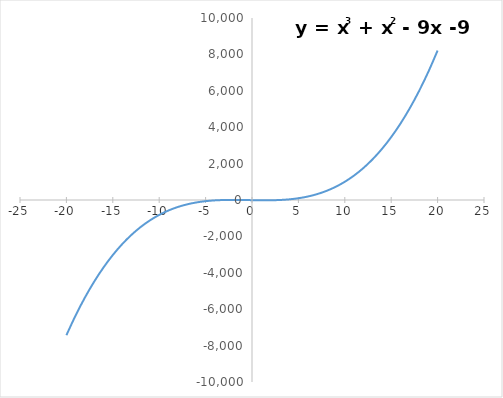
| Category | Series 0 |
|---|---|
| -20.0 | -7429 |
| -19.0 | -6336 |
| -18.0 | -5355 |
| -17.0 | -4480 |
| -16.0 | -3705 |
| -15.0 | -3024 |
| -14.0 | -2431 |
| -13.0 | -1920 |
| -12.0 | -1485 |
| -11.0 | -1120 |
| -10.0 | -819 |
| -9.0 | -576 |
| -8.0 | -385 |
| -7.0 | -240 |
| -6.0 | -135 |
| -5.0 | -64 |
| -4.0 | -21 |
| -3.0 | 0 |
| -2.0 | 5 |
| -1.0 | 0 |
| 0.0 | -9 |
| 1.0 | -16 |
| 2.0 | -15 |
| 3.0 | 0 |
| 4.0 | 35 |
| 5.0 | 96 |
| 6.0 | 189 |
| 7.0 | 320 |
| 8.0 | 495 |
| 9.0 | 720 |
| 10.0 | 1001 |
| 11.0 | 1344 |
| 12.0 | 1755 |
| 13.0 | 2240 |
| 14.0 | 2805 |
| 15.0 | 3456 |
| 16.0 | 4199 |
| 17.0 | 5040 |
| 18.0 | 5985 |
| 19.0 | 7040 |
| 20.0 | 8211 |